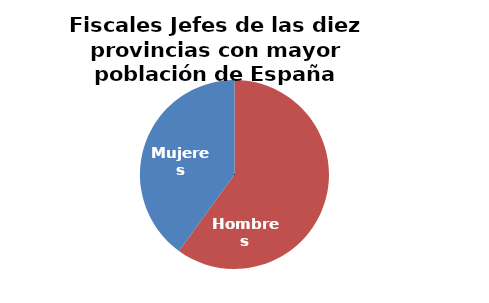
| Category | Fiscales Jefes de las diez provincias con mayor población de España |
|---|---|
| Hombres | 6 |
| Mujeres | 4 |